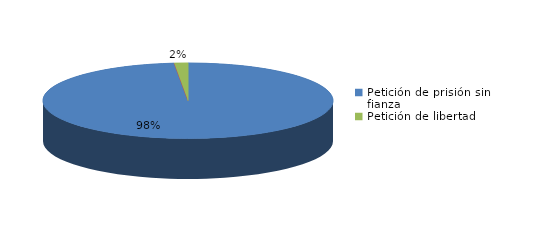
| Category | Series 0 |
|---|---|
| Petición de prisión sin fianza | 65 |
| Peticion de libertad con fianza | 0 |
| Petición de libertad | 1 |